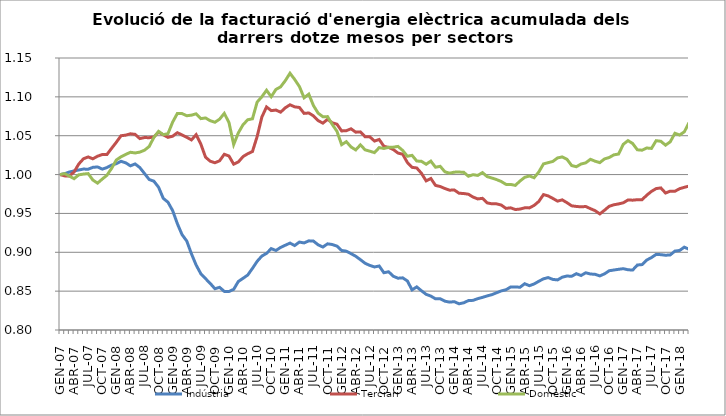
| Category | Indústria | Terciari | Domèstic |
|---|---|---|---|
| GEN-07 | 1 | 1 | 1 |
| FEB-07 | 1.001 | 0.998 | 1.001 |
| MAR-07 | 1.003 | 0.998 | 0.998 |
| ABR-07 | 1.005 | 1.003 | 0.995 |
| MAI-07 | 1.006 | 1.014 | 1 |
| JUN-07 | 1.007 | 1.02 | 1.001 |
| JUL-07 | 1.007 | 1.023 | 1.001 |
| AGO-07 | 1.009 | 1.02 | 0.993 |
| SET-07 | 1.01 | 1.024 | 0.989 |
| OCT-07 | 1.007 | 1.026 | 0.994 |
| NOV-07 | 1.009 | 1.026 | 0.999 |
| DES-07 | 1.012 | 1.034 | 1.008 |
| GEN-08 | 1.014 | 1.042 | 1.019 |
| FEB-08 | 1.017 | 1.05 | 1.023 |
| MAR-08 | 1.015 | 1.051 | 1.026 |
| ABR-08 | 1.011 | 1.052 | 1.029 |
| MAI-08 | 1.014 | 1.052 | 1.028 |
| JUN-08 | 1.009 | 1.046 | 1.029 |
| JUL-08 | 1.001 | 1.048 | 1.031 |
| AGO-08 | 0.994 | 1.047 | 1.036 |
| SET-08 | 0.991 | 1.048 | 1.048 |
| OCT-08 | 0.984 | 1.055 | 1.056 |
| NOV-08 | 0.969 | 1.051 | 1.051 |
| DES-08 | 0.964 | 1.048 | 1.053 |
| GEN-09 | 0.954 | 1.049 | 1.068 |
| FEB-09 | 0.937 | 1.054 | 1.079 |
| MAR-09 | 0.923 | 1.051 | 1.078 |
| ABR-09 | 0.915 | 1.048 | 1.076 |
| MAI-09 | 0.898 | 1.045 | 1.076 |
| JUN-09 | 0.884 | 1.051 | 1.078 |
| JUL-09 | 0.872 | 1.039 | 1.072 |
| AGO-09 | 0.866 | 1.022 | 1.073 |
| SET-09 | 0.86 | 1.017 | 1.069 |
| OCT-09 | 0.853 | 1.015 | 1.067 |
| NOV-09 | 0.855 | 1.018 | 1.071 |
| DES-09 | 0.85 | 1.026 | 1.079 |
| GEN-10 | 0.85 | 1.024 | 1.067 |
| FEB-10 | 0.852 | 1.013 | 1.039 |
| MAR-10 | 0.862 | 1.016 | 1.054 |
| ABR-10 | 0.867 | 1.023 | 1.064 |
| MAI-10 | 0.871 | 1.027 | 1.071 |
| JUN-10 | 0.879 | 1.03 | 1.072 |
| JUL-10 | 0.888 | 1.049 | 1.093 |
| AGO-10 | 0.895 | 1.074 | 1.1 |
| SET-10 | 0.899 | 1.087 | 1.108 |
| OCT-10 | 0.905 | 1.082 | 1.1 |
| NOV-10 | 0.902 | 1.083 | 1.11 |
| DES-10 | 0.906 | 1.08 | 1.113 |
| GEN-11 | 0.909 | 1.086 | 1.121 |
| FEB-11 | 0.912 | 1.09 | 1.13 |
| MAR-11 | 0.909 | 1.087 | 1.122 |
| ABR-11 | 0.913 | 1.086 | 1.113 |
| MAI-11 | 0.912 | 1.079 | 1.099 |
| JUN-11 | 0.915 | 1.079 | 1.104 |
| JUL-11 | 0.914 | 1.076 | 1.089 |
| AGO-11 | 0.91 | 1.069 | 1.079 |
| SET-11 | 0.907 | 1.066 | 1.074 |
| OCT-11 | 0.911 | 1.071 | 1.075 |
| NOV-11 | 0.91 | 1.067 | 1.065 |
| DES-11 | 0.908 | 1.065 | 1.056 |
| GEN-12 | 0.902 | 1.056 | 1.038 |
| FEB-12 | 0.901 | 1.056 | 1.042 |
| MAR-12 | 0.898 | 1.059 | 1.036 |
| ABR-12 | 0.895 | 1.055 | 1.032 |
| MAI-12 | 0.89 | 1.055 | 1.038 |
| JUN-12 | 0.886 | 1.049 | 1.032 |
| JUL-12 | 0.883 | 1.049 | 1.03 |
| AGO-12 | 0.881 | 1.043 | 1.028 |
| SET-12 | 0.882 | 1.045 | 1.035 |
| OCT-12 | 0.874 | 1.036 | 1.034 |
| NOV-12 | 0.875 | 1.035 | 1.035 |
| DES-12 | 0.869 | 1.032 | 1.035 |
| GEN-13 | 0.867 | 1.028 | 1.036 |
| FEB-13 | 0.867 | 1.026 | 1.031 |
| MAR-13 | 0.863 | 1.016 | 1.024 |
| ABR-13 | 0.852 | 1.009 | 1.025 |
| MAI-13 | 0.855 | 1.009 | 1.017 |
| JUN-13 | 0.85 | 1.002 | 1.017 |
| JUL-13 | 0.846 | 0.992 | 1.013 |
| AGO-13 | 0.844 | 0.995 | 1.017 |
| SET-13 | 0.84 | 0.986 | 1.009 |
| OCT-13 | 0.84 | 0.985 | 1.011 |
| NOV-13 | 0.837 | 0.982 | 1.004 |
| DES-13 | 0.836 | 0.98 | 1.002 |
| GEN-14 | 0.836 | 0.98 | 1.003 |
| FEB-14 | 0.834 | 0.976 | 1.003 |
| MAR-14 | 0.835 | 0.976 | 1.003 |
| ABR-14 | 0.838 | 0.975 | 0.998 |
| MAI-14 | 0.838 | 0.971 | 1 |
| JUN-14 | 0.84 | 0.969 | 0.999 |
| JUL-14 | 0.842 | 0.969 | 1.003 |
| AGO-14 | 0.844 | 0.964 | 0.997 |
| SET-14 | 0.845 | 0.962 | 0.996 |
| OCT-14 | 0.848 | 0.962 | 0.994 |
| NOV-14 | 0.85 | 0.961 | 0.991 |
| DES-14 | 0.852 | 0.956 | 0.987 |
| GEN-15 | 0.855 | 0.957 | 0.987 |
| FEB-15 | 0.855 | 0.955 | 0.986 |
| MAR-15 | 0.855 | 0.956 | 0.992 |
| ABR-15 | 0.86 | 0.957 | 0.996 |
| MAI-15 | 0.857 | 0.957 | 0.998 |
| JUN-15 | 0.859 | 0.96 | 0.996 |
| JUL-15 | 0.863 | 0.965 | 1.003 |
| AGO-15 | 0.866 | 0.974 | 1.014 |
| SET-15 | 0.867 | 0.973 | 1.015 |
| OCT-15 | 0.865 | 0.969 | 1.017 |
| NOV-15 | 0.864 | 0.966 | 1.021 |
| DES-15 | 0.868 | 0.967 | 1.023 |
| GEN-16 | 0.869 | 0.964 | 1.02 |
| FEB-16 | 0.869 | 0.96 | 1.012 |
| MAR-16 | 0.872 | 0.959 | 1.01 |
| ABR-16 | 0.87 | 0.958 | 1.014 |
| MAI-16 | 0.874 | 0.959 | 1.015 |
| JUN-16 | 0.872 | 0.956 | 1.02 |
| JUL-16 | 0.872 | 0.954 | 1.017 |
| AGO-16 | 0.87 | 0.949 | 1.015 |
| SET-16 | 0.872 | 0.954 | 1.02 |
| OCT-16 | 0.876 | 0.959 | 1.022 |
| NOV-16 | 0.877 | 0.961 | 1.025 |
| DES-16 | 0.878 | 0.962 | 1.026 |
| GEN-17 | 0.879 | 0.964 | 1.039 |
| FEB-17 | 0.878 | 0.967 | 1.044 |
| MAR-17 | 0.877 | 0.967 | 1.04 |
| ABR-17 | 0.884 | 0.968 | 1.032 |
| MAI-17 | 0.884 | 0.968 | 1.031 |
| JUN-17 | 0.89 | 0.973 | 1.034 |
| JUL-17 | 0.893 | 0.978 | 1.034 |
| AGO-17 | 0.897 | 0.982 | 1.044 |
| SET-17 | 0.897 | 0.983 | 1.043 |
| OCT-17 | 0.896 | 0.976 | 1.038 |
| NOV-17 | 0.897 | 0.979 | 1.042 |
| DES-17 | 0.902 | 0.979 | 1.053 |
| GEN-18 | 0.902 | 0.982 | 1.051 |
| FEB-18 | 0.907 | 0.984 | 1.055 |
| MAR-18 | 0.904 | 0.985 | 1.067 |